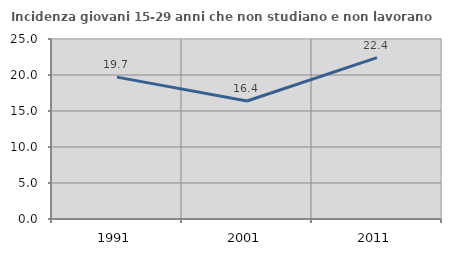
| Category | Incidenza giovani 15-29 anni che non studiano e non lavorano  |
|---|---|
| 1991.0 | 19.708 |
| 2001.0 | 16.393 |
| 2011.0 | 22.414 |